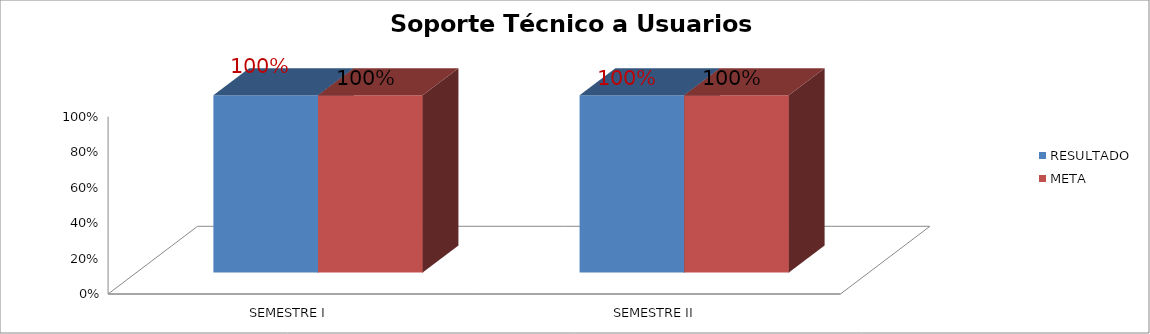
| Category | RESULTADO | META |
|---|---|---|
| SEMESTRE I | 1 | 1 |
| SEMESTRE II | 1 | 1 |